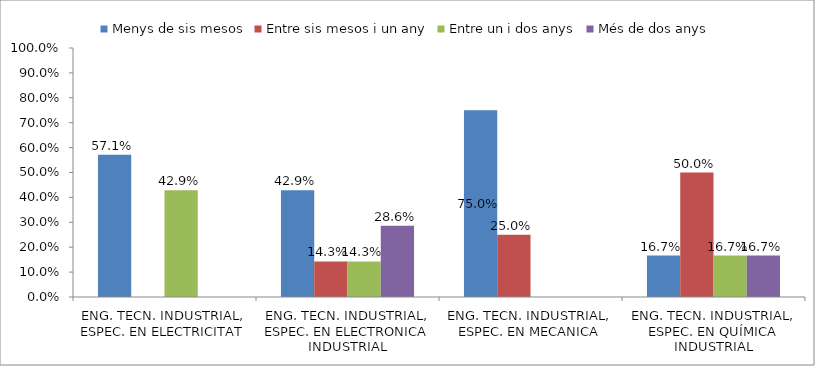
| Category | Menys de sis mesos | Entre sis mesos i un any | Entre un i dos anys | Més de dos anys |
|---|---|---|---|---|
| ENG. TECN. INDUSTRIAL, ESPEC. EN ELECTRICITAT | 0.571 | 0 | 0.429 | 0 |
| ENG. TECN. INDUSTRIAL, ESPEC. EN ELECTRONICA INDUSTRIAL | 0.429 | 0.143 | 0.143 | 0.286 |
| ENG. TECN. INDUSTRIAL, ESPEC. EN MECANICA | 0.75 | 0.25 | 0 | 0 |
| ENG. TECN. INDUSTRIAL, ESPEC. EN QUÍMICA INDUSTRIAL | 0.167 | 0.5 | 0.167 | 0.167 |